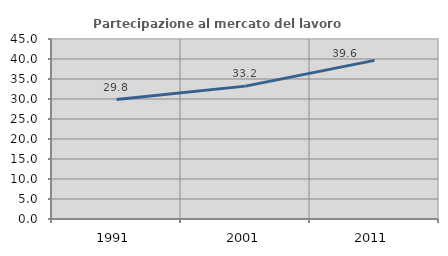
| Category | Partecipazione al mercato del lavoro  femminile |
|---|---|
| 1991.0 | 29.846 |
| 2001.0 | 33.218 |
| 2011.0 | 39.649 |